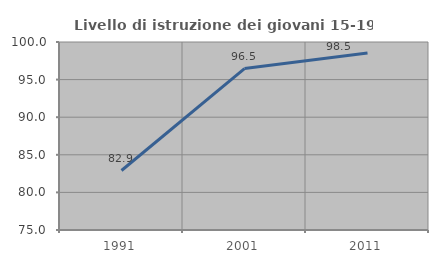
| Category | Livello di istruzione dei giovani 15-19 anni |
|---|---|
| 1991.0 | 82.911 |
| 2001.0 | 96.471 |
| 2011.0 | 98.529 |